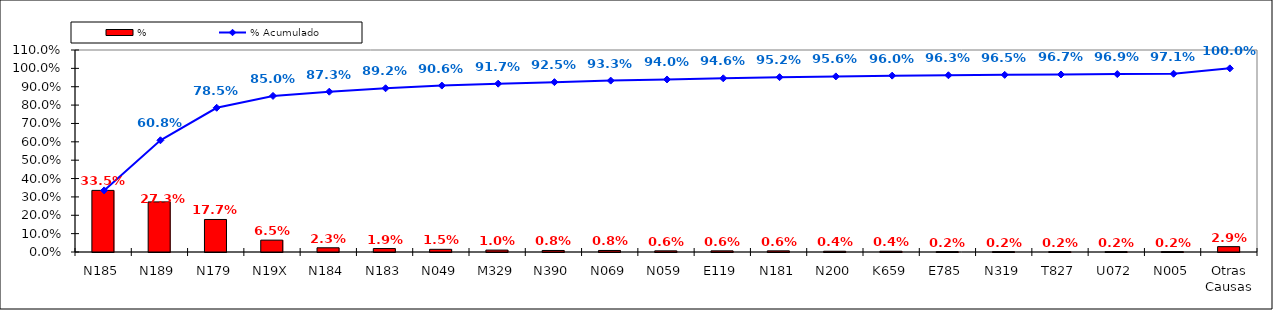
| Category | % |
|---|---|
| N185 | 0.335 |
| N189 | 0.273 |
| N179 | 0.177 |
| N19X | 0.065 |
| N184 | 0.023 |
| N183 | 0.019 |
| N049 | 0.015 |
| M329 | 0.01 |
| N390 | 0.008 |
| N069 | 0.008 |
| N059 | 0.006 |
| E119 | 0.006 |
| N181 | 0.006 |
| N200 | 0.004 |
| K659 | 0.004 |
| E785 | 0.002 |
| N319 | 0.002 |
| T827 | 0.002 |
| U072 | 0.002 |
| N005 | 0.002 |
| Otras Causas | 0.029 |